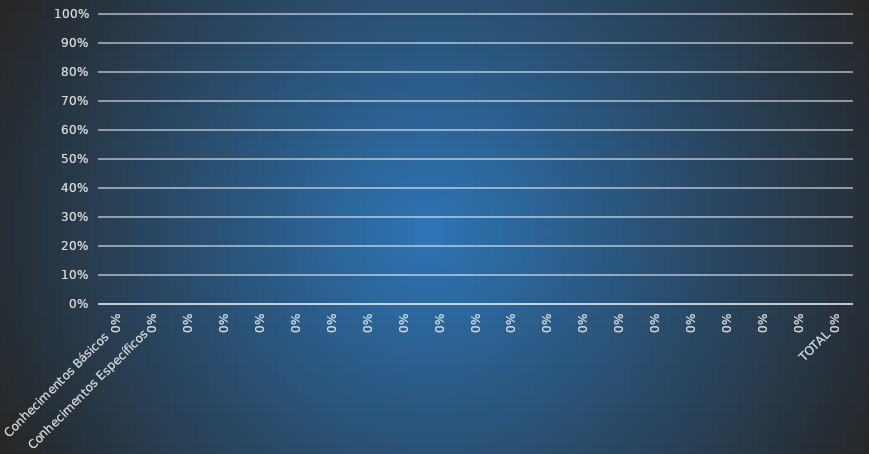
| Category | RENDIMENTO |
|---|---|
| Conhecimentos Básicos  | 0 |
| Conhecimentos Específicos | 0 |
|  | 0 |
|  | 0 |
|  | 0 |
|  | 0 |
|  | 0 |
|  | 0 |
|  | 0 |
|  | 0 |
|  | 0 |
|  | 0 |
|  | 0 |
|  | 0 |
|  | 0 |
|  | 0 |
|  | 0 |
|  | 0 |
|  | 0 |
|  | 0 |
| TOTAL | 0 |